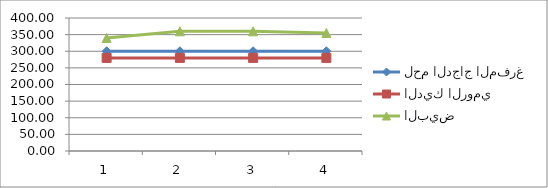
| Category | لحم الدجاج المفرغ | الديك الرومي | البيض |
|---|---|---|---|
| 0 | 300 | 280 | 340 |
| 1 | 300 | 280 | 360 |
| 2 | 300 | 280 | 360 |
| 3 | 300 | 280 | 355 |